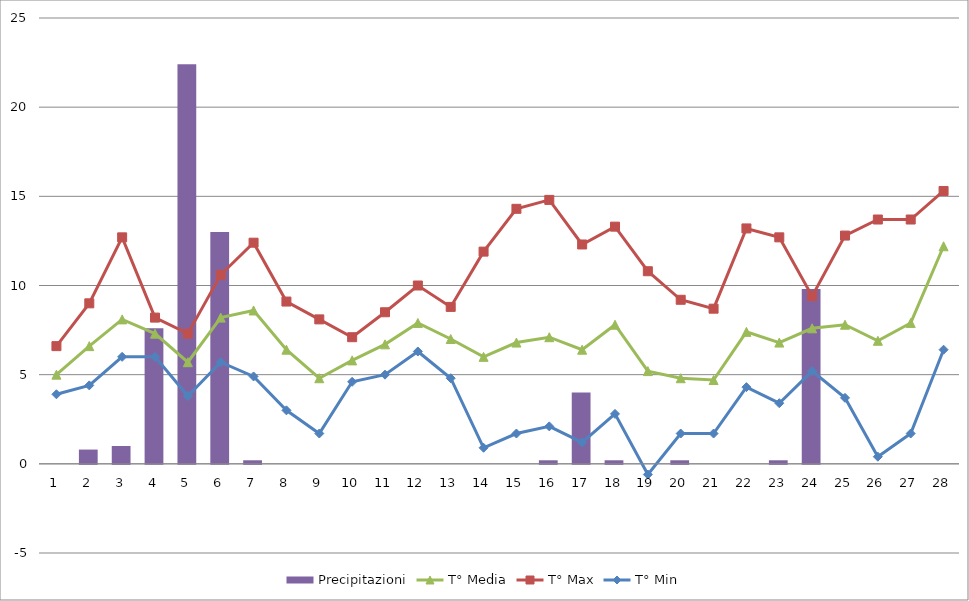
| Category | Precipitazioni |
|---|---|
| 0 | 0 |
| 1 | 0.8 |
| 2 | 1 |
| 3 | 7.6 |
| 4 | 22.4 |
| 5 | 13 |
| 6 | 0.2 |
| 7 | 0 |
| 8 | 0 |
| 9 | 0 |
| 10 | 0 |
| 11 | 0 |
| 12 | 0 |
| 13 | 0 |
| 14 | 0 |
| 15 | 0.2 |
| 16 | 4 |
| 17 | 0.2 |
| 18 | 0 |
| 19 | 0.2 |
| 20 | 0 |
| 21 | 0 |
| 22 | 0.2 |
| 23 | 9.8 |
| 24 | 0 |
| 25 | 0 |
| 26 | 0 |
| 27 | 0 |